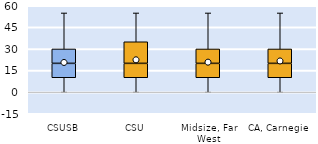
| Category | 25th | 50th | 75th |
|---|---|---|---|
| CSUSB | 10 | 10 | 10 |
| CSU | 10 | 10 | 15 |
| Midsize, Far West | 10 | 10 | 10 |
| CA, Carnegie | 10 | 10 | 10 |